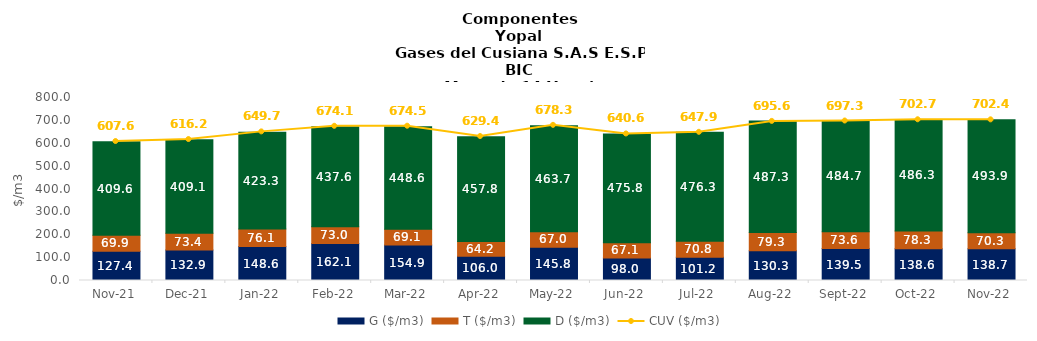
| Category | G ($/m3) | T ($/m3) | D ($/m3) |
|---|---|---|---|
| 2021-11-01 | 127.39 | 69.89 | 409.55 |
| 2021-12-01 | 132.89 | 73.37 | 409.12 |
| 2022-01-01 | 148.58 | 76.09 | 423.28 |
| 2022-02-01 | 162.07 | 73 | 437.58 |
| 2022-03-01 | 154.9 | 69.08 | 448.55 |
| 2022-04-01 | 105.95 | 64.24 | 457.83 |
| 2022-05-01 | 145.79 | 66.96 | 463.72 |
| 2022-06-01 | 98.04 | 67.12 | 475.76 |
| 2022-07-01 | 101.2 | 70.76 | 476.31 |
| 2022-08-01 | 130.34 | 79.28 | 487.29 |
| 2022-09-01 | 139.5 | 73.63 | 484.74 |
| 2022-10-01 | 138.55 | 78.32 | 486.3 |
| 2022-11-01 | 138.65 | 70.31 | 493.89 |